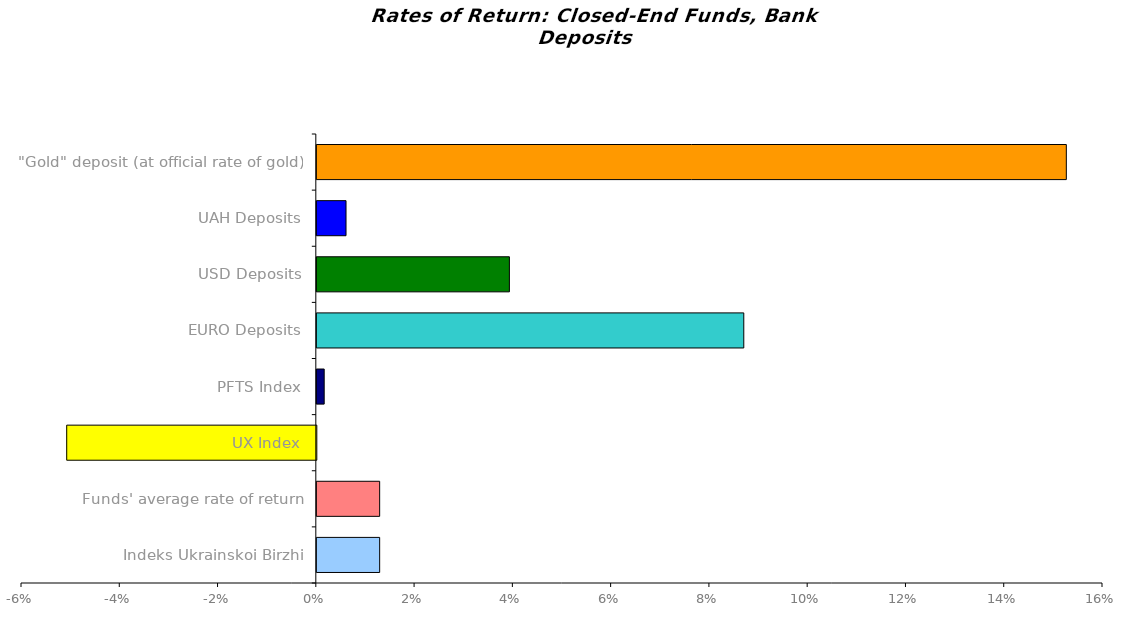
| Category | Series 0 |
|---|---|
| Іndeks Ukrainskoi Birzhi | 0.013 |
| Funds' average rate of return | 0.013 |
| UX Index | -0.051 |
| PFTS Index | 0.002 |
| EURO Deposits | 0.087 |
| USD Deposits | 0.039 |
| UAH Deposits | 0.006 |
| "Gold" deposit (at official rate of gold) | 0.153 |